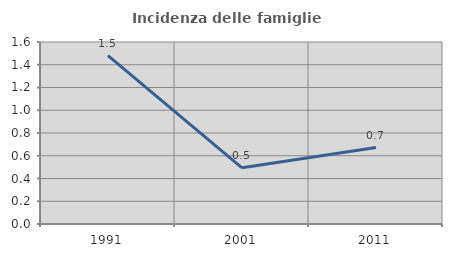
| Category | Incidenza delle famiglie numerose |
|---|---|
| 1991.0 | 1.48 |
| 2001.0 | 0.494 |
| 2011.0 | 0.672 |